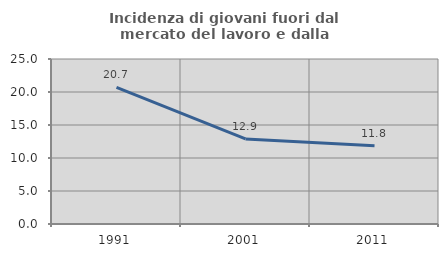
| Category | Incidenza di giovani fuori dal mercato del lavoro e dalla formazione  |
|---|---|
| 1991.0 | 20.71 |
| 2001.0 | 12.883 |
| 2011.0 | 11.842 |